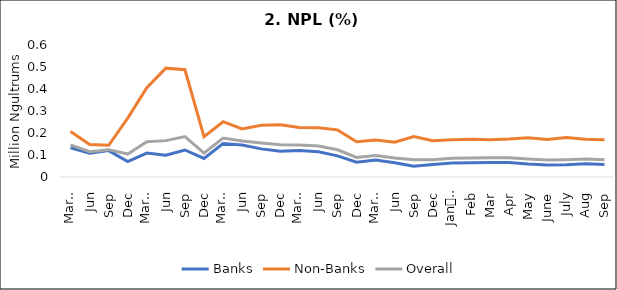
| Category | Banks | Non-Banks | Overall |
|---|---|---|---|
| 0 | 0.133 | 0.207 | 0.146 |
| 1 | 0.108 | 0.148 | 0.115 |
| 2 | 0.12 | 0.144 | 0.124 |
| 3 | 0.07 | 0.268 | 0.104 |
| 4 | 0.109 | 0.406 | 0.16 |
| 5 | 0.099 | 0.495 | 0.165 |
| 6 | 0.123 | 0.487 | 0.184 |
| 7 | 0.084 | 0.183 | 0.109 |
| 8 | 0.152 | 0.251 | 0.177 |
| 9 | 0.145 | 0.218 | 0.164 |
| 10 | 0.128 | 0.235 | 0.154 |
| 11 | 0.117 | 0.237 | 0.146 |
| 12 | 0.121 | 0.226 | 0.146 |
| 13 | 0.115 | 0.224 | 0.141 |
| 14 | 0.096 | 0.214 | 0.124 |
| 15 | 0.067 | 0.16 | 0.089 |
| 16 | 0.077 | 0.168 | 0.098 |
| 17 | 0.065 | 0.158 | 0.086 |
| 18 | 0.048 | 0.183 | 0.078 |
| 19 | 0.057 | 0.165 | 0.079 |
| 20 | 0.063 | 0.169 | 0.085 |
| 21 | 0.065 | 0.171 | 0.086 |
| 22 | 0.066 | 0.169 | 0.087 |
| 23 | 0.066 | 0.173 | 0.087 |
| 24 | 0.06 | 0.178 | 0.082 |
| 25 | 0.055 | 0.17 | 0.077 |
| 26 | 0.056 | 0.179 | 0.079 |
| 27 | 0.06 | 0.172 | 0.081 |
| 28 | 0.057 | 0.17 | 0.079 |